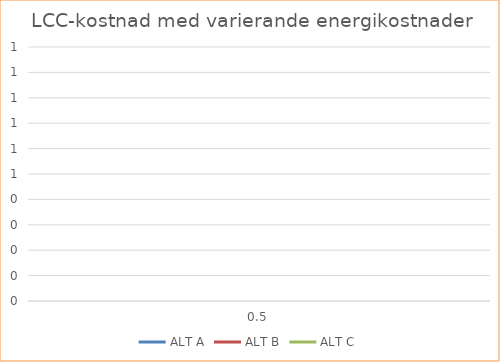
| Category | ALT A | ALT B | ALT C |
|---|---|---|---|
| 0.5 | 0 | 0 | 0 |
| 0.75 | 0 | 0 | 0 |
| 1.0 | 0 | 0 | 0 |
| 1.25 | 0 | 0 | 0 |
| 1.5 | 0 | 0 | 0 |
| 1.75 | 0 | 0 | 0 |
| 2.0 | 0 | 0 | 0 |